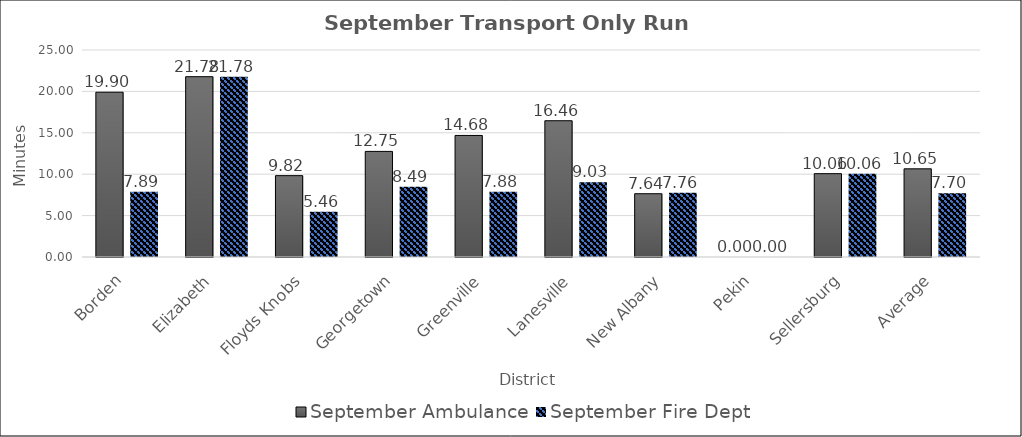
| Category | September |
|---|---|
| Borden | 7.89 |
| Elizabeth | 21.78 |
| Floyds Knobs | 5.456 |
| Georgetown | 8.486 |
| Greenville | 7.88 |
| Lanesville | 9.028 |
| New Albany | 7.76 |
| Pekin | 0 |
| Sellersburg | 10.064 |
| Average | 7.704 |